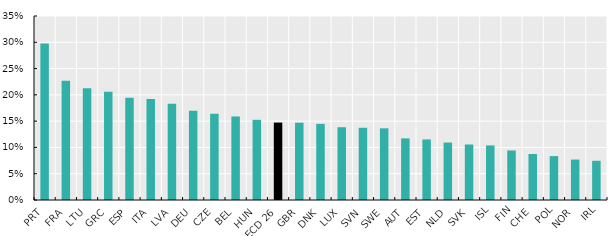
| Category | Mental distress (MHI-5) |
|---|---|
| PRT | 0.298 |
| FRA | 0.227 |
| LTU | 0.213 |
| GRC | 0.206 |
| ESP | 0.195 |
| ITA | 0.192 |
| LVA | 0.183 |
| DEU | 0.17 |
| CZE | 0.164 |
| BEL | 0.159 |
| HUN | 0.153 |
| OECD 26 | 0.147 |
| GBR | 0.147 |
| DNK | 0.145 |
| LUX | 0.138 |
| SVN | 0.137 |
| SWE | 0.136 |
| AUT | 0.117 |
| EST | 0.115 |
| NLD | 0.109 |
| SVK | 0.106 |
| ISL | 0.104 |
| FIN | 0.094 |
| CHE | 0.087 |
| POL | 0.084 |
| NOR | 0.077 |
| IRL | 0.075 |